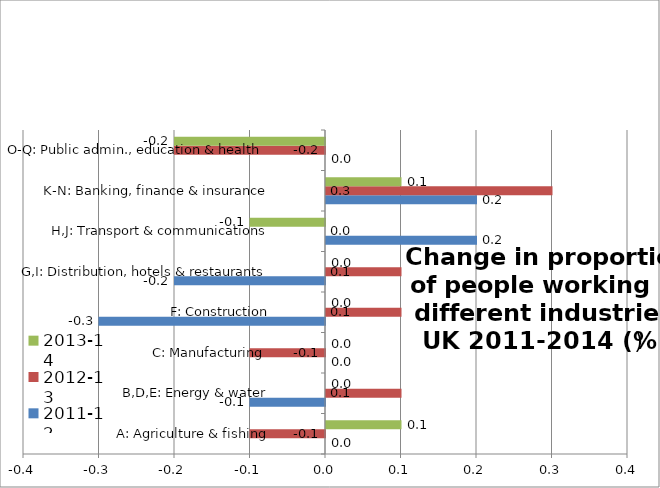
| Category | 2011-12 | 2012-13 | 2013-14 |
|---|---|---|---|
|  A: Agriculture & fishing | 0 | -0.1 | 0.1 |
| B,D,E: Energy & water | -0.1 | 0.1 | 0 |
| C: Manufacturing  | 0 | -0.1 | 0 |
| F: Construction | -0.3 | 0.1 | 0 |
| G,I: Distribution, hotels & restaurants | -0.2 | 0.1 | 0 |
| H,J: Transport & communications | 0.2 | 0 | -0.1 |
| K-N: Banking, finance & insurance | 0.2 | 0.3 | 0.1 |
| O-Q: Public admin., education & health  | 0 | -0.2 | -0.2 |